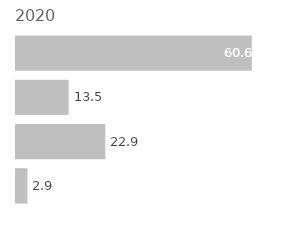
| Category | Series 0 |
|---|---|
| 0 | 2.941 |
| 1 | 22.941 |
| 2 | 13.529 |
| 3 | 60.588 |